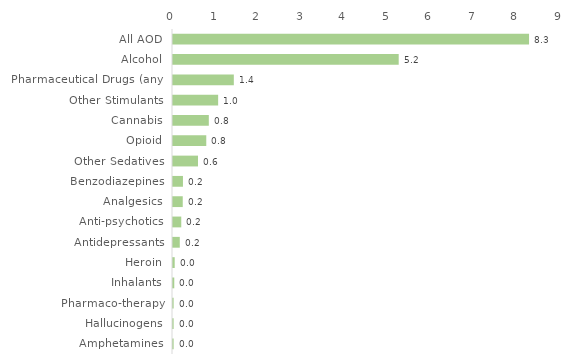
| Category | Series 0 |
|---|---|
| All AOD | 8.28 |
| Alcohol | 5.249 |
| Pharmaceutical Drugs (any) | 1.415 |
| Other Stimulants | 1.05 |
| Cannabis | 0.833 |
| Opioid | 0.774 |
| Other Sedatives | 0.582 |
| Benzodiazepines | 0.232 |
| Analgesics | 0.227 |
| Anti-psychotics | 0.192 |
| Antidepressants | 0.158 |
| Heroin | 0.039 |
| Inhalants | 0.03 |
| Pharmaco-therapy | 0.015 |
| Hallucinogens | 0.015 |
| Amphetamines | 0.015 |